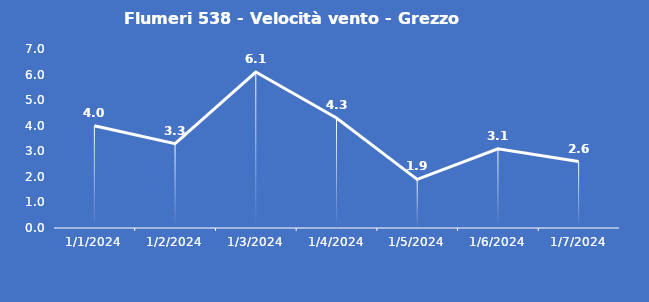
| Category | Flumeri 538 - Velocità vento - Grezzo (m/s) |
|---|---|
| 1/1/24 | 4 |
| 1/2/24 | 3.3 |
| 1/3/24 | 6.1 |
| 1/4/24 | 4.3 |
| 1/5/24 | 1.9 |
| 1/6/24 | 3.1 |
| 1/7/24 | 2.6 |